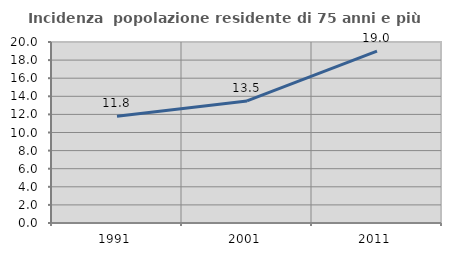
| Category | Incidenza  popolazione residente di 75 anni e più |
|---|---|
| 1991.0 | 11.797 |
| 2001.0 | 13.485 |
| 2011.0 | 18.99 |